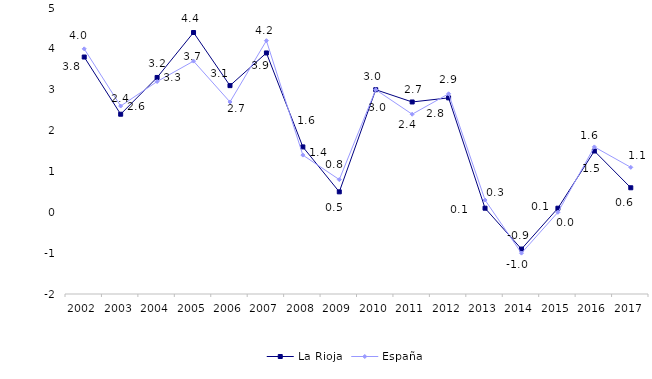
| Category | La Rioja | España |
|---|---|---|
| 2002.0 | 3.8 | 4 |
| 2003.0 | 2.4 | 2.6 |
| 2004.0 | 3.3 | 3.2 |
| 2005.0 | 4.4 | 3.7 |
| 2006.0 | 3.1 | 2.7 |
| 2007.0 | 3.9 | 4.2 |
| 2008.0 | 1.6 | 1.4 |
| 2009.0 | 0.5 | 0.8 |
| 2010.0 | 3 | 3 |
| 2011.0 | 2.7 | 2.4 |
| 2012.0 | 2.8 | 2.9 |
| 2013.0 | 0.1 | 0.3 |
| 2014.0 | -0.9 | -1 |
| 2015.0 | 0.1 | 0 |
| 2016.0 | 1.5 | 1.6 |
| 2017.0 | 0.6 | 1.1 |